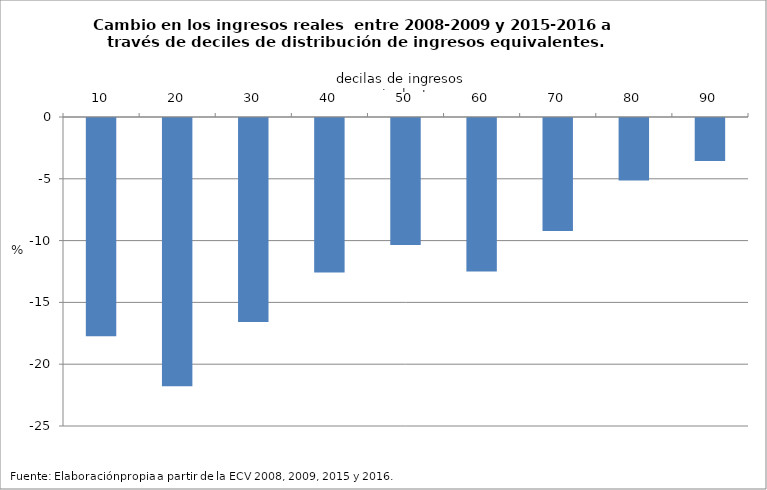
| Category | Cambio de ingresos reales |
|---|---|
| 10.0 | -17.658 |
| 20.0 | -21.705 |
| 30.0 | -16.507 |
| 40.0 | -12.505 |
| 50.0 | -10.269 |
| 60.0 | -12.409 |
| 70.0 | -9.137 |
| 80.0 | -5.058 |
| 90.0 | -3.478 |